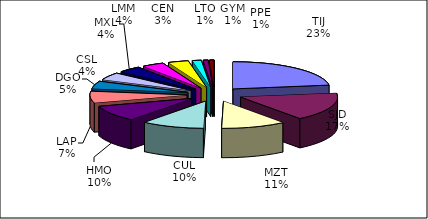
| Category | Series 0 |
|---|---|
| TIJ | 90440 |
| SJD | 66679 |
| MZT | 42849 |
| CUL | 41611 |
| HMO | 37801 |
| LAP | 27537 |
| DGO | 17910 |
| CSL | 17269 |
| MXL | 15347 |
| LMM | 14538 |
| CEN | 13420 |
| LTO | 5910 |
| GYM | 3240 |
| PPE | 2944 |